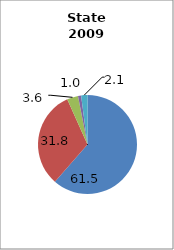
| Category | Arkansas |
|---|---|
| White | 61.452 |
| Black | 31.843 |
| Hispanic | 3.628 |
| Two or More Races | 1.015 |
| All Other1 | 2.062 |